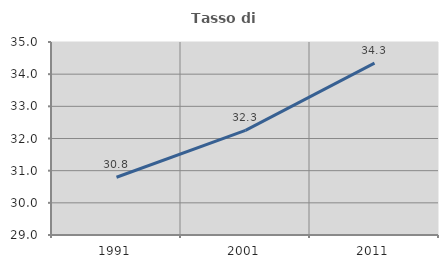
| Category | Tasso di occupazione   |
|---|---|
| 1991.0 | 30.795 |
| 2001.0 | 32.252 |
| 2011.0 | 34.344 |